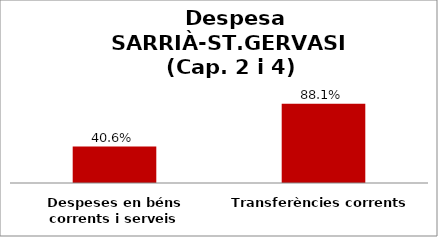
| Category | Series 0 |
|---|---|
| Despeses en béns corrents i serveis | 0.406 |
| Transferències corrents | 0.881 |